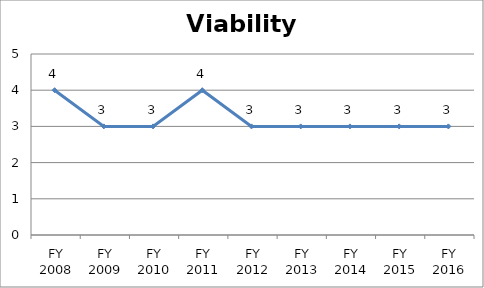
| Category | Viability score |
|---|---|
| FY 2016 | 3 |
| FY 2015 | 3 |
| FY 2014 | 3 |
| FY 2013 | 3 |
| FY 2012 | 3 |
| FY 2011 | 4 |
| FY 2010 | 3 |
| FY 2009 | 3 |
| FY 2008 | 4 |